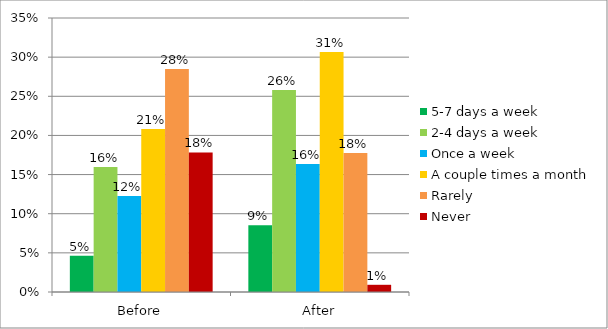
| Category | 5-7 days a week | 2-4 days a week | Once a week | A couple times a month | Rarely | Never |
|---|---|---|---|---|---|---|
| Before | 0.046 | 0.16 | 0.123 | 0.208 | 0.285 | 0.178 |
| After | 0.085 | 0.258 | 0.164 | 0.306 | 0.177 | 0.009 |